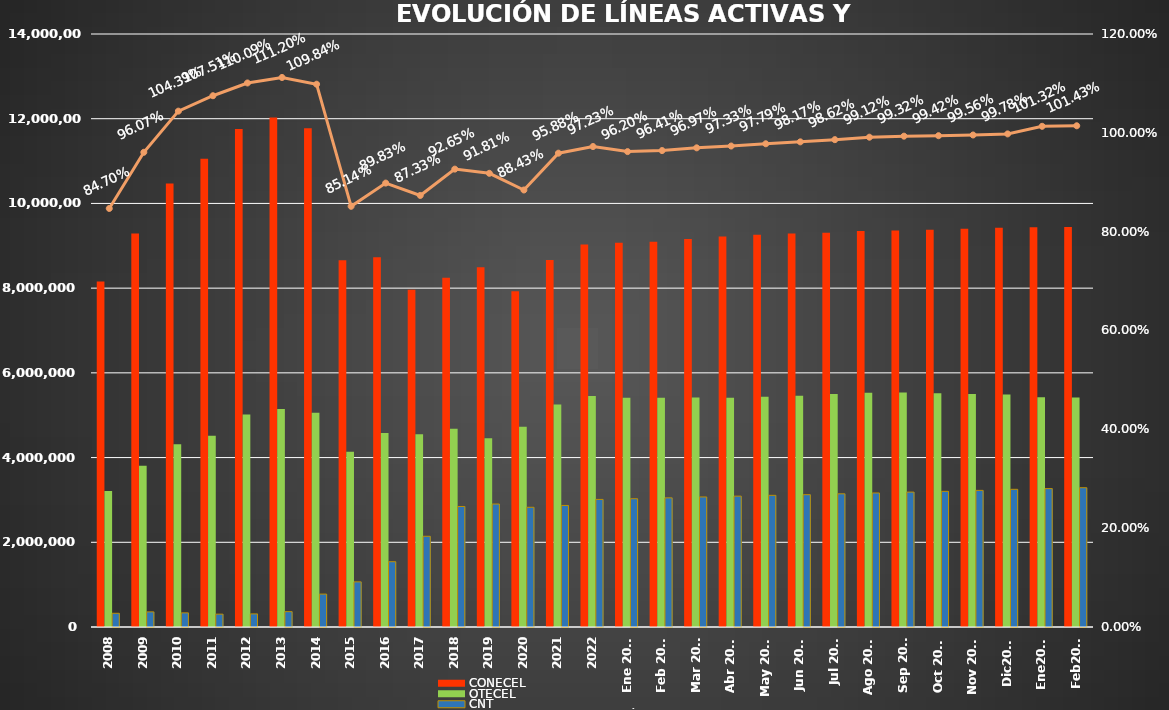
| Category | CONECEL | OTECEL | CNT |
|---|---|---|---|
| 2008 | 8156359 | 3211922 | 323967 |
| 2009 | 9291268 | 3806432 | 356900 |
| 2010 | 10470502 | 4314599 | 333730 |
| 2011 | 11057316 | 4513874 | 303368 |
| 2012 | 11757906 | 5019686 | 309271 |
| 2013 | 12030886 | 5148308 | 362560 |
| 2014 | 11772020 | 5055645 | 776892 |
| 2015 | 8658619 | 4134698 | 1065703 |
| 2016 | 8726823 | 4580092 | 1541219 |
| 2017 | 7960263 | 4549024 | 2142117 |
| 2018 | 8248050 | 4679646 | 2845142 |
| 2019 | 8493054 | 4456356 | 2903690 |
| 2020 | 7929253 | 4729725 | 2826388 |
| 2021 | 8665715 | 5254468 | 2869417 |
| 2022 | 9027737 | 5451115 | 3011899 |
| Ene 2023 | 9073421 | 5411860 | 3028254 |
| Feb 2023 | 9092490 | 5410682 | 3048837 |
| Mar 2023 | 9162562 | 5419670 | 3070611 |
| Abr 2023 | 9220042 | 5409581 | 3089410 |
| May 2023 | 9259499 | 5434175 | 3108405 |
| Jun 2023 | 9290231 | 5458655 | 3123905 |
| Jul 2023 | 9310350 | 5499232 | 3144067 |
| Ago 2023 | 9349530 | 5530451 | 3164614 |
| Sep 2023 | 9361007 | 5536629 | 3184663 |
| Oct 2023 | 9378363 | 5518632 | 3202774 |
| Nov 2023 | 9399776 | 5500199 | 3225513 |
| Dic2023 | 9425714 | 5489576 | 3250322 |
| Ene2024 | 9435179 | 5426792 | 3267658 |
| Feb2024 | 9444024 | 5416623 | 3288468 |